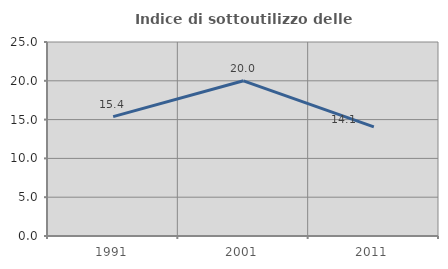
| Category | Indice di sottoutilizzo delle abitazioni  |
|---|---|
| 1991.0 | 15.385 |
| 2001.0 | 20 |
| 2011.0 | 14.062 |